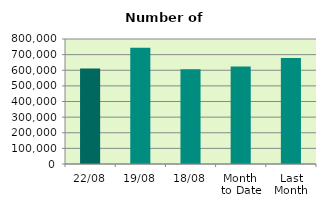
| Category | Series 0 |
|---|---|
| 22/08 | 611986 |
| 19/08 | 744442 |
| 18/08 | 606868 |
| Month 
to Date | 623960.75 |
| Last
Month | 677996.667 |